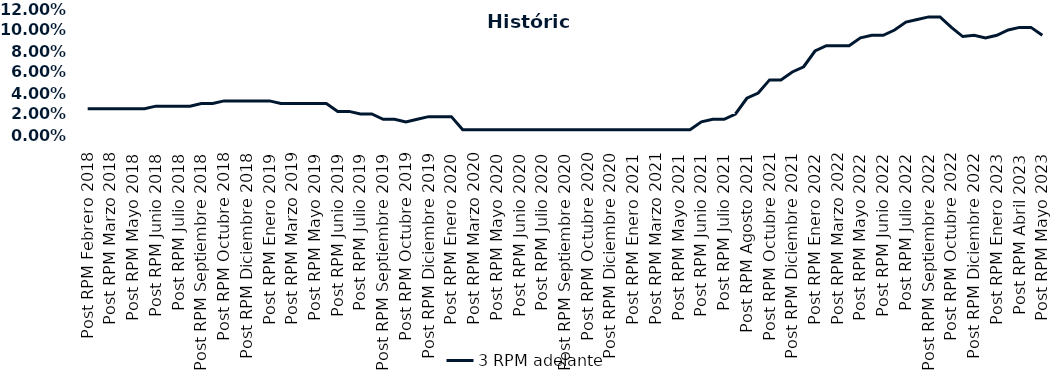
| Category | 3 RPM adelante |
|---|---|
| Post RPM Febrero 2018 | 0.025 |
| Pre RPM Marzo 2018 | 0.025 |
| Post RPM Marzo 2018 | 0.025 |
| Pre RPM Mayo 2018 | 0.025 |
| Post RPM Mayo 2018 | 0.025 |
| Pre RPM Junio 2018 | 0.025 |
| Post RPM Junio 2018 | 0.028 |
| Pre RPM Julio 2018 | 0.028 |
| Post RPM Julio 2018 | 0.028 |
| Pre RPM Septiembre 2018 | 0.028 |
| Post RPM Septiembre 2018 | 0.03 |
| Pre RPM Octubre 2018 | 0.03 |
| Post RPM Octubre 2018 | 0.032 |
| Pre RPM Diciembre 2018 | 0.032 |
| Post RPM Diciembre 2018 | 0.032 |
| Pre RPM Enero 2019 | 0.032 |
| Post RPM Enero 2019 | 0.032 |
| Pre RPM Marzo 2019 | 0.03 |
| Post RPM Marzo 2019 | 0.03 |
| Pre RPM Mayo 2019 | 0.03 |
| Post RPM Mayo 2019 | 0.03 |
| Pre RPM Junio 2019 | 0.03 |
| Post RPM Junio 2019 | 0.022 |
| Pre RPM Julio 2019 | 0.022 |
| Post RPM Julio 2019 | 0.02 |
| Pre RPM Septiembre 2019 | 0.02 |
| Post RPM Septiembre 2019 | 0.015 |
| Pre RPM Octubre 2019 | 0.015 |
| Post RPM Octubre 2019 | 0.012 |
| Pre RPM Diciembre 2019 | 0.015 |
| Post RPM Diciembre 2019 | 0.018 |
| Pre RPM Enero 2020 | 0.018 |
| Post RPM Enero 2020 | 0.018 |
| Pre RPM Marzo 2020 | 0.005 |
| Post RPM Marzo 2020 | 0.005 |
| Pre RPM Mayo 2020 | 0.005 |
| Post RPM Mayo 2020 | 0.005 |
| Pre RPM Junio 2020 | 0.005 |
| Post RPM Junio 2020 | 0.005 |
| Pre RPM Julio 2020 | 0.005 |
| Post RPM Julio 2020 | 0.005 |
| Pre RPM Septiembre 2020 | 0.005 |
| Post RPM Septiembre 2020 | 0.005 |
| Pre RPM Octubre 2020 | 0.005 |
| Post RPM Octubre 2020 | 0.005 |
| Pre RPM Diciembre 2020 | 0.005 |
| Post RPM Diciembre 2020 | 0.005 |
| Pre RPM Enero 2021 | 0.005 |
| Post RPM Enero 2021 | 0.005 |
| Pre RPM Marzo 2021 | 0.005 |
| Post RPM Marzo 2021 | 0.005 |
| Pre RPM Mayo 2021 | 0.005 |
| Post RPM Mayo 2021 | 0.005 |
| Pre RPM Junio 2021 | 0.005 |
| Post RPM Junio 2021 | 0.012 |
| Pre RPM Julio 2021 | 0.015 |
| Post RPM Julio 2021 | 0.015 |
| Pre RPM Agosto 2021 | 0.02 |
| Post RPM Agosto 2021 | 0.035 |
| Pre RPM Octubre 2021 | 0.04 |
| Post RPM Octubre 2021 | 0.052 |
| Pre RPM Diciembre 2021 | 0.052 |
| Post RPM Diciembre 2021 | 0.06 |
| Pre RPM Enero 2022 | 0.065 |
| Post RPM Enero 2022 | 0.08 |
| Pre RPM Marzo 2022 | 0.085 |
| Post RPM Marzo 2022 | 0.085 |
| Pre RPM Mayo 2022 | 0.085 |
| Post RPM Mayo 2022 | 0.092 |
| Pre RPM Junio 2022 | 0.095 |
| Post RPM Junio 2022 | 0.095 |
| Pre RPM Julio 2022 | 0.1 |
| Post RPM Julio 2022 | 0.108 |
| Pre RPM Septiembre 2022 | 0.11 |
| Post RPM Septiembre 2022 | 0.112 |
| Pre RPM Octubre 2022 | 0.112 |
| Post RPM Octubre 2022 | 0.102 |
| Pre RPM Diciembre 2022 | 0.094 |
| Post RPM Diciembre 2022 | 0.095 |
| Pre RPM Enero 2023 | 0.092 |
| Post RPM Enero 2023 | 0.095 |
| Pre RPM Abril 2023 | 0.1 |
| Post RPM Abril 2023 | 0.102 |
| Pre RPM Mayo 2023 | 0.102 |
| Post RPM Mayo 2023 | 0.095 |